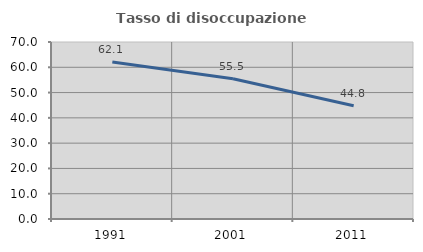
| Category | Tasso di disoccupazione giovanile  |
|---|---|
| 1991.0 | 62.088 |
| 2001.0 | 55.455 |
| 2011.0 | 44.792 |